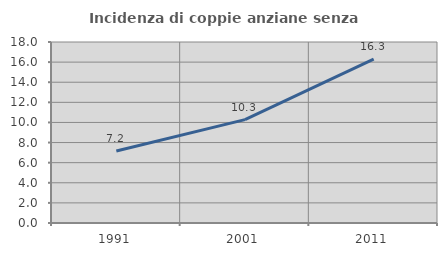
| Category | Incidenza di coppie anziane senza figli  |
|---|---|
| 1991.0 | 7.162 |
| 2001.0 | 10.278 |
| 2011.0 | 16.297 |